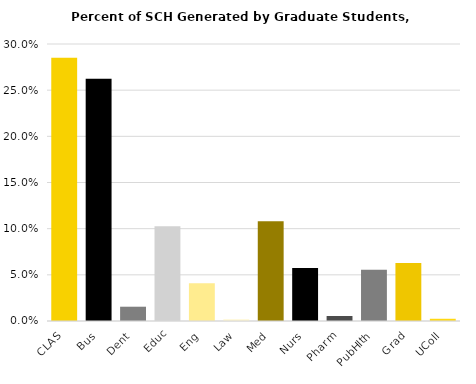
| Category | Series 0 |
|---|---|
| CLAS | 0.285 |
| Bus | 0.262 |
| Dent | 0.015 |
| Educ | 0.102 |
| Eng | 0.041 |
| Law | 0.002 |
| Med | 0.108 |
| Nurs | 0.057 |
| Pharm | 0.005 |
| PubHlth | 0.056 |
| Grad | 0.063 |
| UColl | 0.002 |